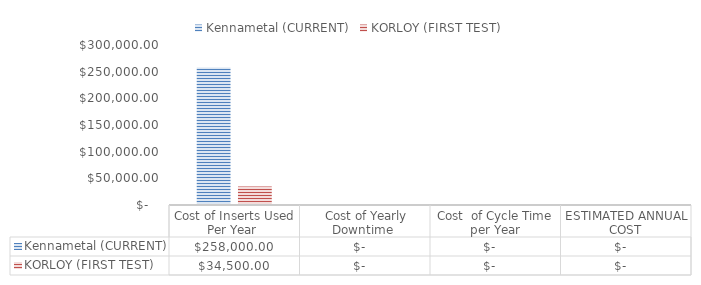
| Category | Kennametal (CURRENT) | KORLOY (FIRST TEST) |
|---|---|---|
| Cost of Inserts Used Per Year  | 258000 | 34500 |
|  Cost of Yearly Downtime  | 0 | 0 |
| Cost  of Cycle Time per Year | 0 | 0 |
| ESTIMATED ANNUAL COST | 0 | 0 |